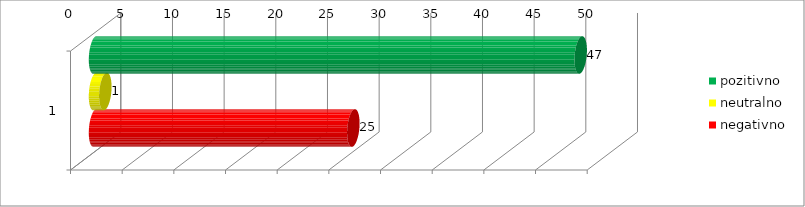
| Category | pozitivno | neutralno | negativno |
|---|---|---|---|
| 0 | 47 | 1 | 25 |